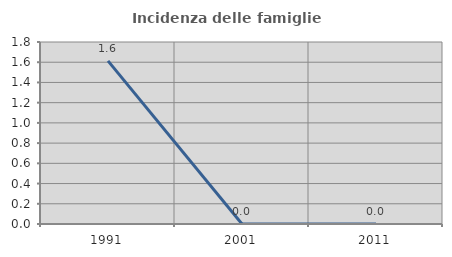
| Category | Incidenza delle famiglie numerose |
|---|---|
| 1991.0 | 1.613 |
| 2001.0 | 0 |
| 2011.0 | 0 |